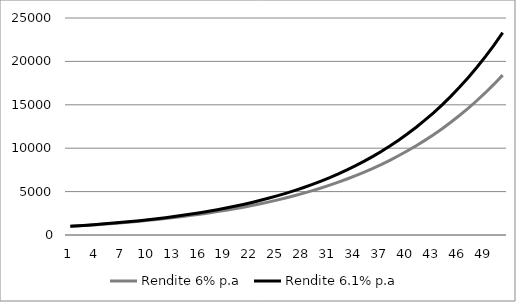
| Category | Rendite 6% p.a | Rendite 6.1% p.a |
|---|---|---|
| 0 | 1000 | 1000 |
| 1 | 1060 | 1065 |
| 2 | 1123.6 | 1134.225 |
| 3 | 1191.016 | 1207.95 |
| 4 | 1262.477 | 1286.466 |
| 5 | 1338.226 | 1370.087 |
| 6 | 1418.519 | 1459.142 |
| 7 | 1503.63 | 1553.987 |
| 8 | 1593.848 | 1654.996 |
| 9 | 1689.479 | 1762.57 |
| 10 | 1790.848 | 1877.137 |
| 11 | 1898.299 | 1999.151 |
| 12 | 2012.196 | 2129.096 |
| 13 | 2132.928 | 2267.487 |
| 14 | 2260.904 | 2414.874 |
| 15 | 2396.558 | 2571.841 |
| 16 | 2540.352 | 2739.011 |
| 17 | 2692.773 | 2917.046 |
| 18 | 2854.339 | 3106.654 |
| 19 | 3025.6 | 3308.587 |
| 20 | 3207.135 | 3523.645 |
| 21 | 3399.564 | 3752.682 |
| 22 | 3603.537 | 3996.606 |
| 23 | 3819.75 | 4256.386 |
| 24 | 4048.935 | 4533.051 |
| 25 | 4291.871 | 4827.699 |
| 26 | 4549.383 | 5141.5 |
| 27 | 4822.346 | 5475.697 |
| 28 | 5111.687 | 5831.617 |
| 29 | 5418.388 | 6210.672 |
| 30 | 5743.491 | 6614.366 |
| 31 | 6088.101 | 7044.3 |
| 32 | 6453.387 | 7502.179 |
| 33 | 6840.59 | 7989.821 |
| 34 | 7251.025 | 8509.159 |
| 35 | 7686.087 | 9062.255 |
| 36 | 8147.252 | 9651.301 |
| 37 | 8636.087 | 10278.636 |
| 38 | 9154.252 | 10946.747 |
| 39 | 9703.507 | 11658.286 |
| 40 | 10285.718 | 12416.075 |
| 41 | 10902.861 | 13223.119 |
| 42 | 11557.033 | 14082.622 |
| 43 | 12250.455 | 14997.993 |
| 44 | 12985.482 | 15972.862 |
| 45 | 13764.611 | 17011.098 |
| 46 | 14590.487 | 18116.82 |
| 47 | 15465.917 | 19294.413 |
| 48 | 16393.872 | 20548.55 |
| 49 | 17377.504 | 21884.205 |
| 50 | 18420.154 | 23306.679 |